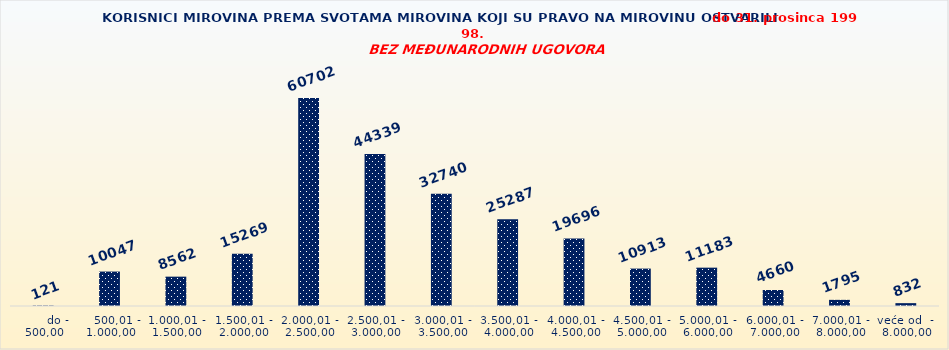
| Category | Series 0 |
|---|---|
|       do - 500,00 | 121 |
|    500,01 - 1.000,00 | 10047 |
| 1.000,01 - 1.500,00 | 8562 |
| 1.500,01 - 2.000,00 | 15269 |
| 2.000,01 - 2.500,00 | 60702 |
| 2.500,01 - 3.000,00 | 44339 |
| 3.000,01 - 3.500,00 | 32740 |
| 3.500,01 - 4.000,00 | 25287 |
| 4.000,01 - 4.500,00 | 19696 |
| 4.500,01 - 5.000,00 | 10913 |
| 5.000,01 - 6.000,00 | 11183 |
| 6.000,01 - 7.000,00 | 4660 |
| 7.000,01 - 8.000,00 | 1795 |
| veće od  -  8.000,00 | 832 |